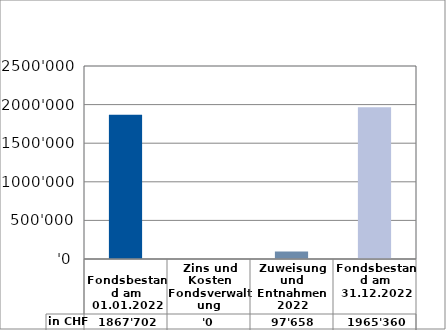
| Category | in CHF |
|---|---|
| 
Fondsbestand am 01.01.2022

 | 1867702 |
| Zins und Kosten Fondsverwaltung | 0 |
| Zuweisung und Entnahmen 2022 | 97658 |
| Fondsbestand am 31.12.2022 | 1965360 |